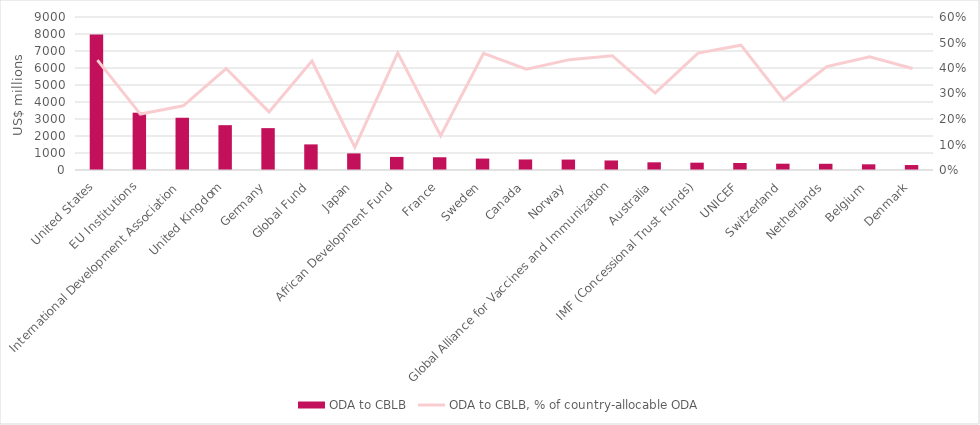
| Category | ODA to CBLB |
|---|---|
| United States | 7972.717 |
| EU Institutions | 3371.7 |
| International Development Association | 3073.702 |
| United Kingdom | 2637.643 |
| Germany | 2463.012 |
| Global Fund | 1506.759 |
| Japan | 976.329 |
| African Development Fund | 769.444 |
| France | 750.32 |
| Sweden | 671.709 |
| Canada | 619.684 |
| Norway | 614.212 |
| Global Alliance for Vaccines and Immunization | 560.827 |
| Australia | 452.508 |
| IMF (Concessional Trust Funds) | 431.143 |
| UNICEF | 412.925 |
| Switzerland | 371.061 |
| Netherlands | 365.923 |
| Belgium | 334.695 |
| Denmark | 292.477 |